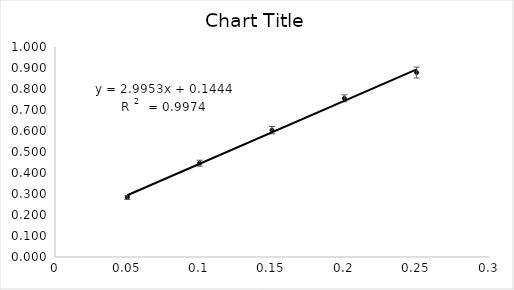
| Category | Series 0 |
|---|---|
| 0.05 | 0.284 |
| 0.1 | 0.447 |
| 0.15 | 0.604 |
| 0.2 | 0.756 |
| 0.25 | 0.878 |